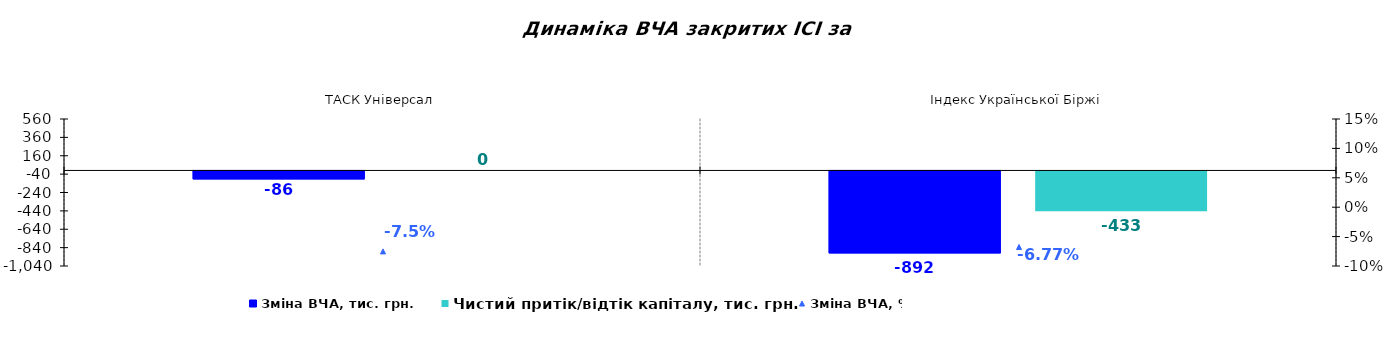
| Category | Зміна ВЧА, тис. грн. | Чистий притік/відтік капіталу, тис. грн. |
|---|---|---|
| ТАСК Універсал | -86.284 | 0 |
| Індекс Української Біржі | -891.9 | -433.055 |